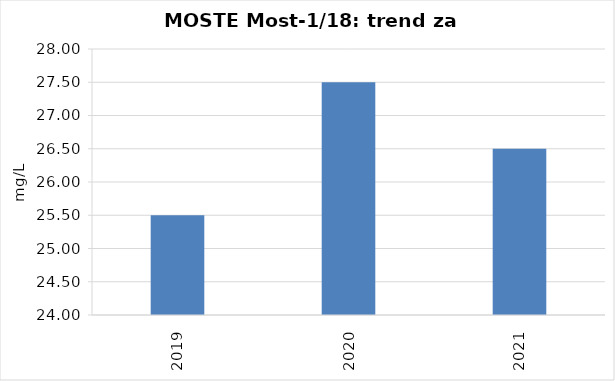
| Category | Vsota |
|---|---|
| 2019 | 25.5 |
| 2020 | 27.5 |
| 2021 | 26.5 |